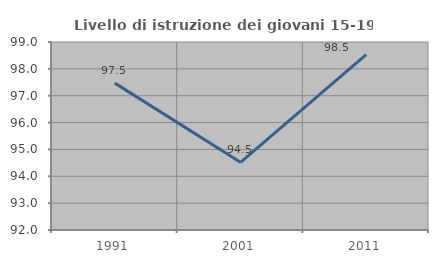
| Category | Livello di istruzione dei giovani 15-19 anni |
|---|---|
| 1991.0 | 97.468 |
| 2001.0 | 94.521 |
| 2011.0 | 98.529 |